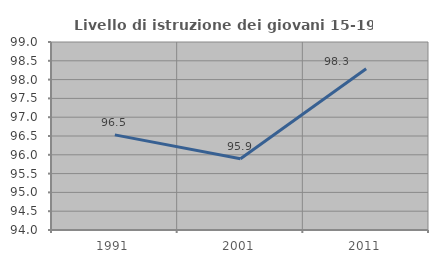
| Category | Livello di istruzione dei giovani 15-19 anni |
|---|---|
| 1991.0 | 96.531 |
| 2001.0 | 95.894 |
| 2011.0 | 98.289 |